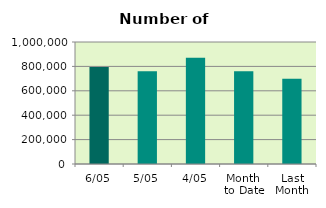
| Category | Series 0 |
|---|---|
| 6/05 | 795038 |
| 5/05 | 760364 |
| 4/05 | 871688 |
| Month 
to Date | 760231 |
| Last
Month | 699227 |